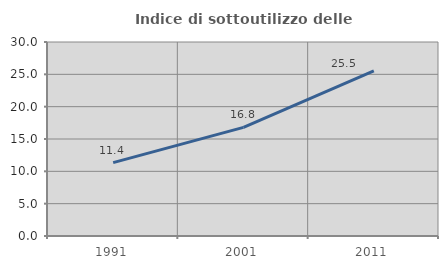
| Category | Indice di sottoutilizzo delle abitazioni  |
|---|---|
| 1991.0 | 11.351 |
| 2001.0 | 16.798 |
| 2011.0 | 25.536 |